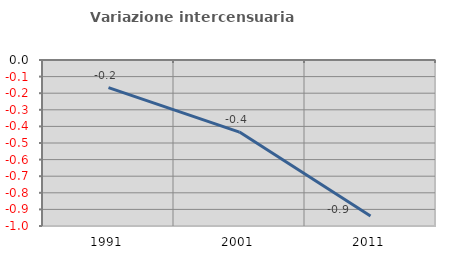
| Category | Variazione intercensuaria annua |
|---|---|
| 1991.0 | -0.167 |
| 2001.0 | -0.434 |
| 2011.0 | -0.94 |